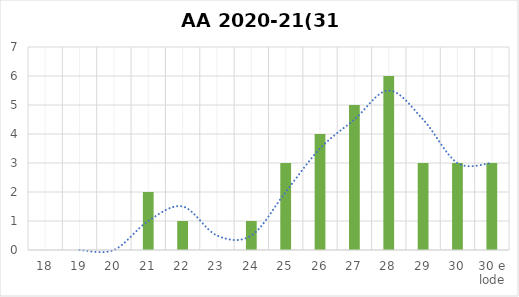
| Category | Series 0 |
|---|---|
| 18 | 0 |
| 19 | 0 |
| 20 | 0 |
| 21 | 2 |
| 22 | 1 |
| 23 | 0 |
| 24 | 1 |
| 25 | 3 |
| 26 | 4 |
| 27 | 5 |
| 28 | 6 |
| 29 | 3 |
| 30 | 3 |
| 30 e lode | 3 |